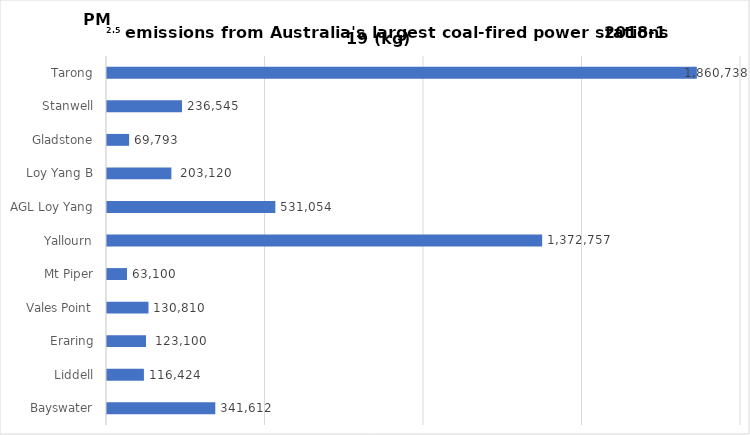
| Category | Series 0 |
|---|---|
| Bayswater | 341611.938 |
| Liddell | 116424.03 |
|  Eraring  | 123100 |
| Vales Point | 130810 |
| Mt Piper | 63100 |
| Yallourn | 1372757 |
| AGL Loy Yang | 531053.927 |
|  Loy Yang B  | 203120 |
| Gladstone | 69793.1 |
| Stanwell | 236545 |
| Tarong | 1860738 |